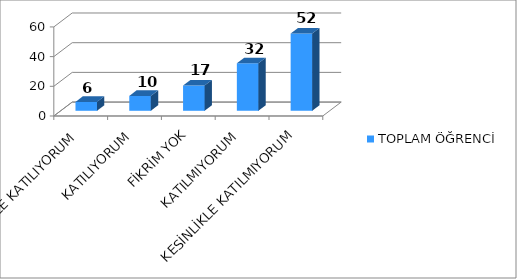
| Category | TOPLAM ÖĞRENCİ |
|---|---|
| KESİNLİKLE KATILIYORUM | 6 |
| KATILIYORUM | 10 |
| FİKRİM YOK | 17 |
| KATILMIYORUM | 32 |
| KESİNLİKLE KATILMIYORUM | 52 |